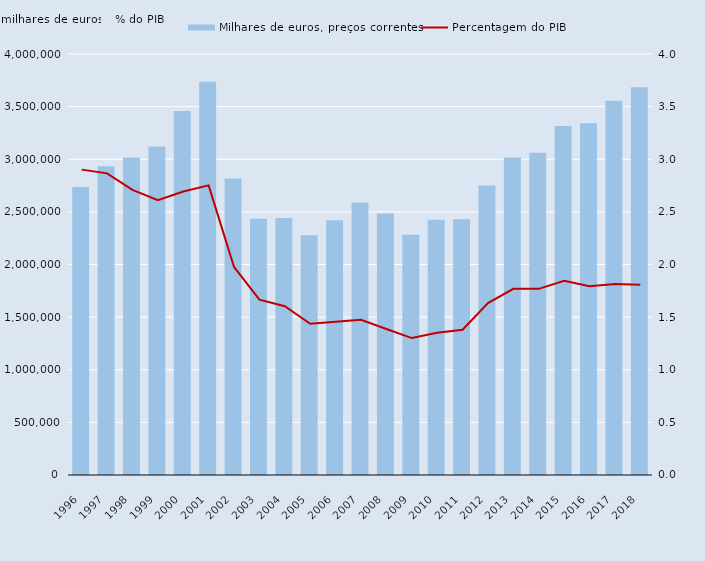
| Category | Milhares de euros, preços correntes |
|---|---|
| 1996.0 | 2737490 |
| 1997.0 | 2932550 |
| 1998.0 | 3016290 |
| 1999.0 | 3121680 |
| 2000.0 | 3458120 |
| 2001.0 | 3736820 |
| 2002.0 | 2817880 |
| 2003.0 | 2433780 |
| 2004.0 | 2442160 |
| 2005.0 | 2277250 |
| 2006.0 | 2420270 |
| 2007.0 | 2588420 |
| 2008.0 | 2484680 |
| 2009.0 | 2281870 |
| 2010.0 | 2425900 |
| 2011.0 | 2430490 |
| 2012.0 | 2749460 |
| 2013.0 | 3015780 |
| 2014.0 | 3060710 |
| 2015.0 | 3315620 |
| 2016.0 | 3343200 |
| 2017.0 | 3554750 |
| 2018.0 | 3684540 |